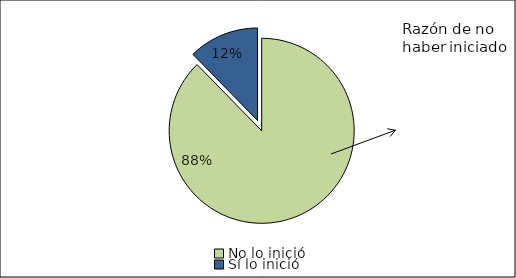
| Category | Series 0 |
|---|---|
| No lo inició | 0.877 |
| Sí lo inició | 0.123 |